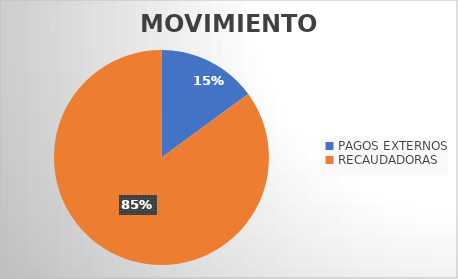
| Category | MOVIMIENTOS |
|---|---|
| PAGOS EXTERNOS | 16841 |
| RECAUDADORAS | 95851 |